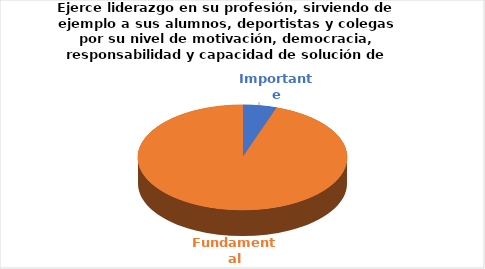
| Category | Series 0 |
|---|---|
| Importante | 1 |
| Fundamental | 18 |